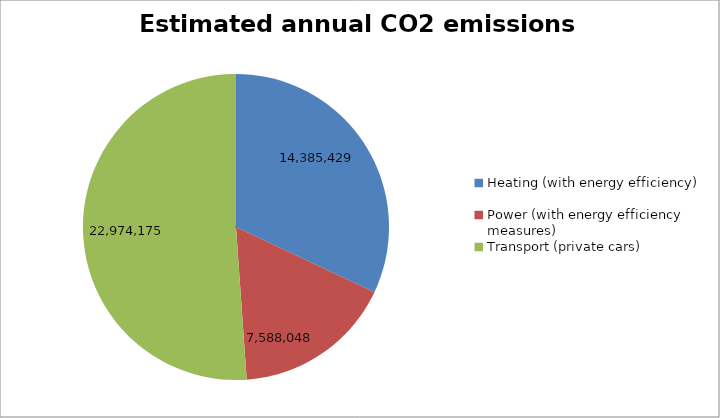
| Category | Estimated annual CO2 emissions (kg/yr) |
|---|---|
| Heating (with energy efficiency) | 14385428.93 |
| Power (with energy efficiency measures) | 7588048.491 |
| Transport (private cars) | 22974174.539 |